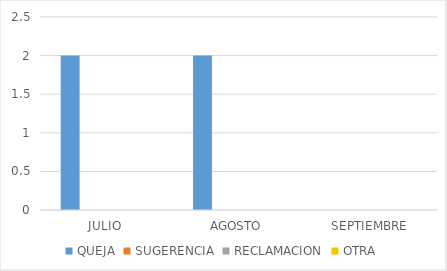
| Category | QUEJA | SUGERENCIA | RECLAMACION | OTRA |
|---|---|---|---|---|
| JULIO | 2 | 0 | 0 | 0 |
| AGOSTO | 2 | 0 | 0 | 0 |
| SEPTIEMBRE | 0 | 0 | 0 | 0 |